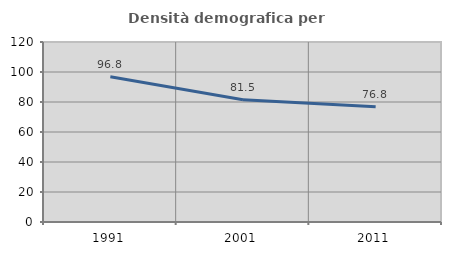
| Category | Densità demografica |
|---|---|
| 1991.0 | 96.828 |
| 2001.0 | 81.487 |
| 2011.0 | 76.77 |